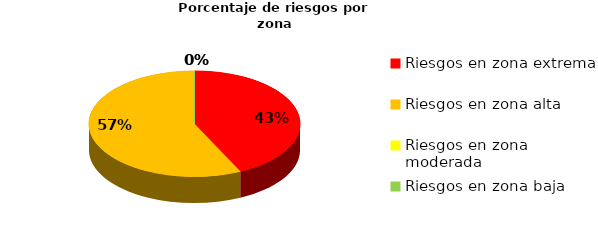
| Category | Series 0 | Series 1 |
|---|---|---|
| Riesgos en zona extrema | 6 | 0.429 |
| Riesgos en zona alta | 8 | 0.571 |
| Riesgos en zona moderada | 0 | 0 |
| Riesgos en zona baja | 0 | 0 |